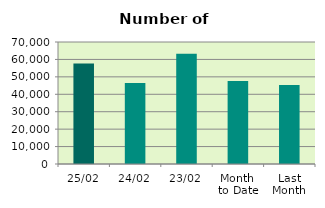
| Category | Series 0 |
|---|---|
| 25/02 | 57722 |
| 24/02 | 46404 |
| 23/02 | 63212 |
| Month 
to Date | 47577.158 |
| Last
Month | 45378.8 |